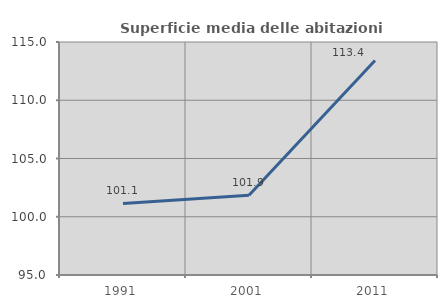
| Category | Superficie media delle abitazioni occupate |
|---|---|
| 1991.0 | 101.148 |
| 2001.0 | 101.85 |
| 2011.0 | 113.417 |